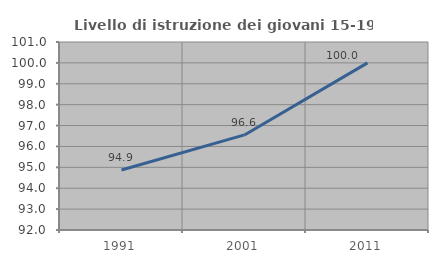
| Category | Livello di istruzione dei giovani 15-19 anni |
|---|---|
| 1991.0 | 94.872 |
| 2001.0 | 96.552 |
| 2011.0 | 100 |